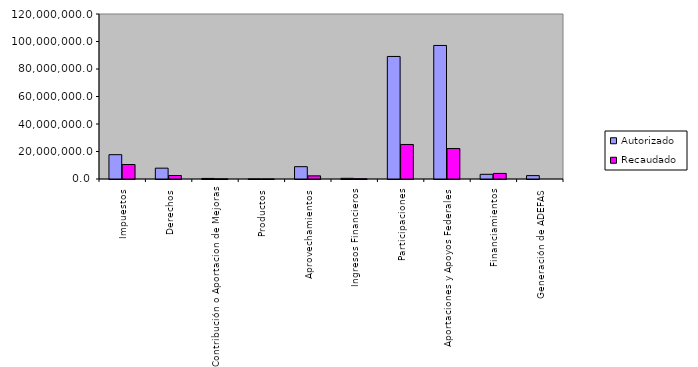
| Category | Autorizado | Recaudado |
|---|---|---|
| 0 | 17682469.3 | 10540103.7 |
| 1 | 7885711.7 | 2528899.3 |
| 2 | 407606.6 | 100113.8 |
| 3 | 38168.4 | 3664.5 |
| 4 | 8955145.3 | 2285951.3 |
| 5 | 498559.3 | 168983 |
| 6 | 89121174.7 | 25105997.2 |
| 7 | 97123725.7 | 22155890.9 |
| 8 | 3400000 | 4046852.8 |
| 9 | 2460700 | 0 |